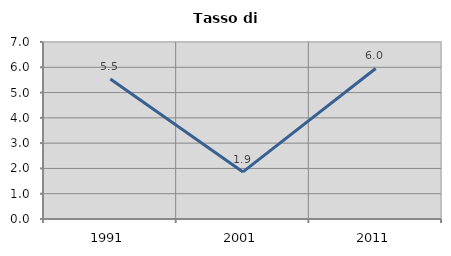
| Category | Tasso di disoccupazione   |
|---|---|
| 1991.0 | 5.535 |
| 2001.0 | 1.862 |
| 2011.0 | 5.953 |